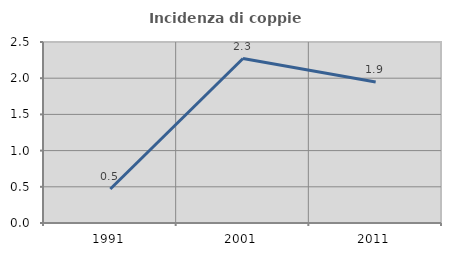
| Category | Incidenza di coppie miste |
|---|---|
| 1991.0 | 0.469 |
| 2001.0 | 2.272 |
| 2011.0 | 1.947 |